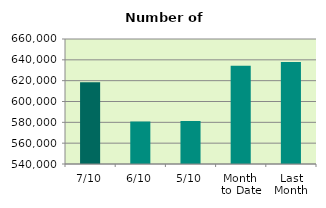
| Category | Series 0 |
|---|---|
| 7/10 | 618600 |
| 6/10 | 580804 |
| 5/10 | 581184 |
| Month 
to Date | 634234 |
| Last
Month | 637968.273 |